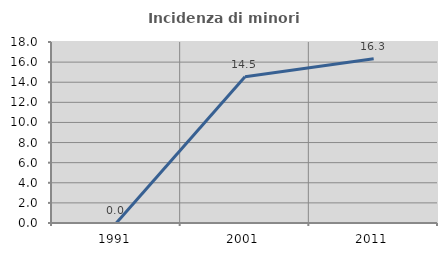
| Category | Incidenza di minori stranieri |
|---|---|
| 1991.0 | 0 |
| 2001.0 | 14.545 |
| 2011.0 | 16.327 |